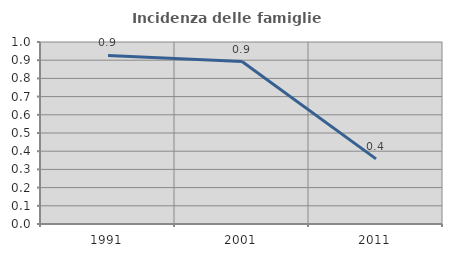
| Category | Incidenza delle famiglie numerose |
|---|---|
| 1991.0 | 0.926 |
| 2001.0 | 0.893 |
| 2011.0 | 0.358 |